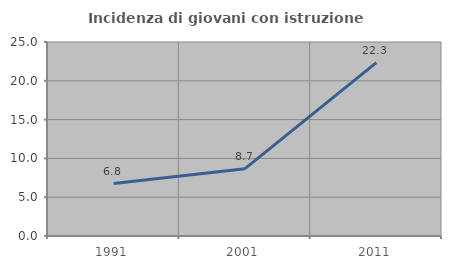
| Category | Incidenza di giovani con istruzione universitaria |
|---|---|
| 1991.0 | 6.759 |
| 2001.0 | 8.68 |
| 2011.0 | 22.339 |